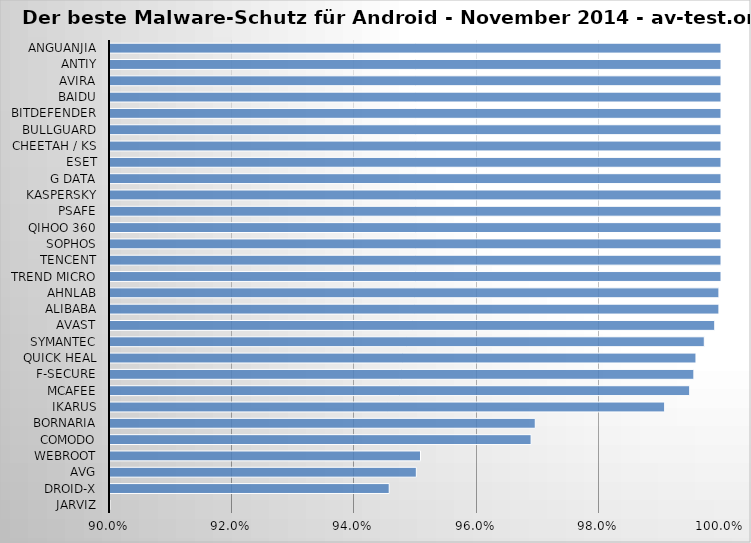
| Category | Series 0 |
|---|---|
| Jarviz | 0.512 |
| Droid-X | 0.946 |
| AVG | 0.95 |
| Webroot | 0.951 |
| Comodo | 0.969 |
| Bornaria | 0.97 |
| Ikarus | 0.991 |
| McAfee | 0.995 |
| F-Secure | 0.996 |
| Quick Heal | 0.996 |
| Symantec | 0.997 |
| Avast | 0.999 |
| Alibaba | 1 |
| Ahnlab | 1 |
| Trend Micro | 1 |
| Tencent | 1 |
| Sophos | 1 |
| Qihoo 360 | 1 |
| PSafe | 1 |
| Kaspersky | 1 |
| G Data | 1 |
| ESET | 1 |
| Cheetah / KS | 1 |
| BullGuard | 1 |
| Bitdefender | 1 |
| Baidu | 1 |
| Avira | 1 |
| Antiy | 1 |
| Anguanjia | 1 |